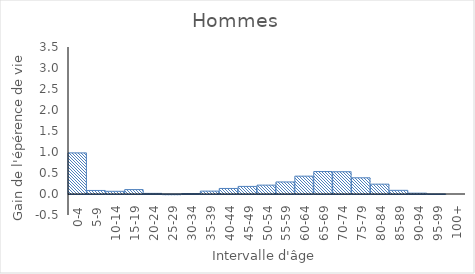
| Category | Hommes |
|---|---|
| 0-4 | 0.979 |
| 5-9 | 0.084 |
| 10-14 | 0.064 |
| 15-19 | 0.105 |
| 20-24 | 0.015 |
| 25-29 | -0.004 |
| 30-34 | 0.01 |
| 35-39 | 0.069 |
| 40-44 | 0.132 |
| 45-49 | 0.181 |
| 50-54 | 0.211 |
| 55-59 | 0.287 |
| 60-64 | 0.425 |
| 65-69 | 0.535 |
| 70-74 | 0.53 |
| 75-79 | 0.386 |
| 80-84 | 0.234 |
| 85-89 | 0.087 |
| 90-94 | 0.02 |
| 95-99 | 0.001 |
| 100+ | 0 |